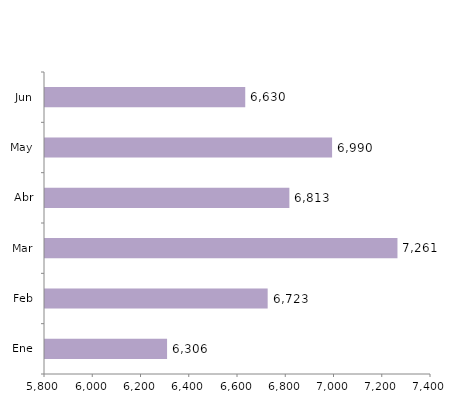
| Category | Series 0 |
|---|---|
| Ene | 6306 |
| Feb | 6723 |
| Mar | 7261 |
| Abr | 6813 |
| May | 6990 |
| Jun | 6630 |